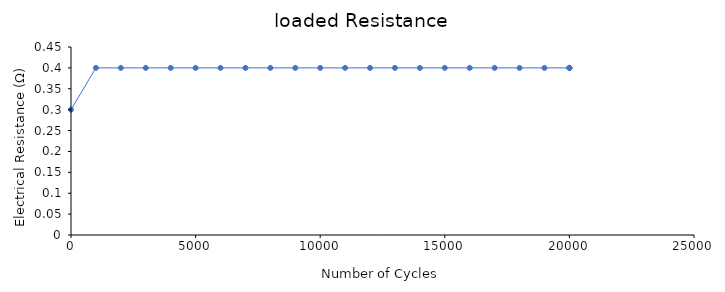
| Category | loaded Resistance |
|---|---|
| 0.0 | 0.3 |
| 1000.0 | 0.4 |
| 2000.0 | 0.4 |
| 3000.0 | 0.4 |
| 4000.0 | 0.4 |
| 5000.0 | 0.4 |
| 6000.0 | 0.4 |
| 7000.0 | 0.4 |
| 8000.0 | 0.4 |
| 9000.0 | 0.4 |
| 10000.0 | 0.4 |
| 11000.0 | 0.4 |
| 12000.0 | 0.4 |
| 13000.0 | 0.4 |
| 14000.0 | 0.4 |
| 15000.0 | 0.4 |
| 16000.0 | 0.4 |
| 17000.0 | 0.4 |
| 18000.0 | 0.4 |
| 19000.0 | 0.4 |
| 20000.0 | 0.4 |
| 20000.0 | 0.4 |
| 20000.0 | 0.4 |
| 20000.0 | 0.4 |